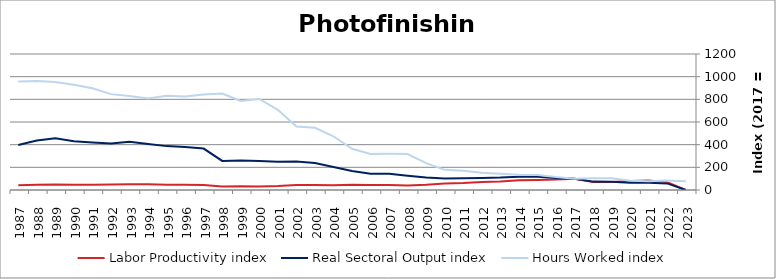
| Category | Labor Productivity index | Real Sectoral Output index | Hours Worked index |
|---|---|---|---|
| 2023.0 | 0 | 0 | 77.207 |
| 2022.0 | 69.505 | 58.365 | 83.972 |
| 2021.0 | 83.159 | 64.569 | 77.644 |
| 2020.0 | 78.552 | 63.93 | 81.386 |
| 2019.0 | 70.985 | 73.533 | 103.589 |
| 2018.0 | 71.469 | 73.933 | 103.449 |
| 2017.0 | 100 | 100 | 100 |
| 2016.0 | 93.267 | 106.052 | 113.707 |
| 2015.0 | 88.825 | 116.818 | 131.514 |
| 2014.0 | 86.14 | 116.616 | 135.379 |
| 2013.0 | 76.06 | 109.534 | 144.009 |
| 2012.0 | 70.445 | 106.562 | 151.27 |
| 2011.0 | 61.635 | 104.153 | 168.985 |
| 2010.0 | 57.315 | 101.948 | 177.871 |
| 2009.0 | 46.373 | 110.01 | 237.226 |
| 2008.0 | 39.85 | 126.485 | 317.402 |
| 2007.0 | 44.792 | 143.021 | 319.299 |
| 2006.0 | 45.107 | 143.654 | 318.472 |
| 2005.0 | 46.281 | 168.204 | 363.444 |
| 2004.0 | 42.918 | 203.415 | 473.963 |
| 2003.0 | 43.244 | 237.24 | 548.606 |
| 2002.0 | 45.017 | 252.197 | 560.224 |
| 2001.0 | 35.111 | 248.429 | 707.547 |
| 2000.0 | 31.742 | 254.944 | 803.175 |
| 1999.0 | 33.2 | 260.646 | 785.069 |
| 1998.0 | 30.123 | 256.596 | 851.824 |
| 1997.0 | 43.352 | 365.37 | 842.797 |
| 1996.0 | 45.987 | 379.235 | 824.661 |
| 1995.0 | 46.593 | 387.167 | 830.96 |
| 1994.0 | 50.35 | 406.764 | 807.868 |
| 1993.0 | 51.3 | 424.961 | 828.382 |
| 1992.0 | 48.389 | 409.298 | 845.855 |
| 1991.0 | 46.754 | 419.743 | 897.772 |
| 1990.0 | 46.388 | 430.532 | 928.118 |
| 1989.0 | 47.946 | 456.901 | 952.956 |
| 1988.0 | 45.36 | 435.936 | 961.066 |
| 1987.0 | 41.586 | 397.733 | 956.399 |